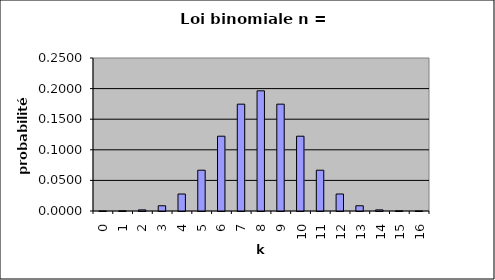
| Category | Series 0 |
|---|---|
| 0.0 | 0 |
| 1.0 | 0 |
| 2.0 | 0.002 |
| 3.0 | 0.009 |
| 4.0 | 0.028 |
| 5.0 | 0.067 |
| 6.0 | 0.122 |
| 7.0 | 0.175 |
| 8.0 | 0.196 |
| 9.0 | 0.175 |
| 10.0 | 0.122 |
| 11.0 | 0.067 |
| 12.0 | 0.028 |
| 13.0 | 0.009 |
| 14.0 | 0.002 |
| 15.0 | 0 |
| 16.0 | 0 |